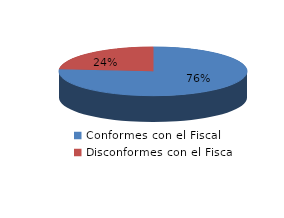
| Category | Series 0 |
|---|---|
| 0 | 110 |
| 1 | 34 |